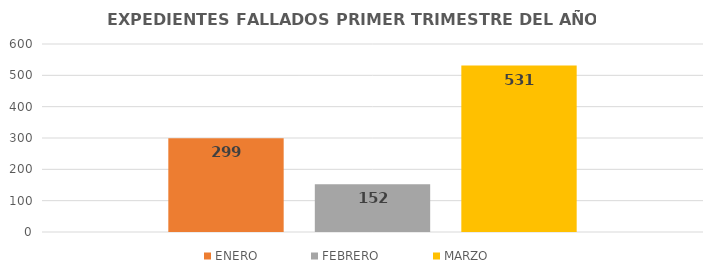
| Category | ENERO | FEBRERO | MARZO |
|---|---|---|---|
| TOTAL 
FALLADOS | 299 | 152 | 531 |